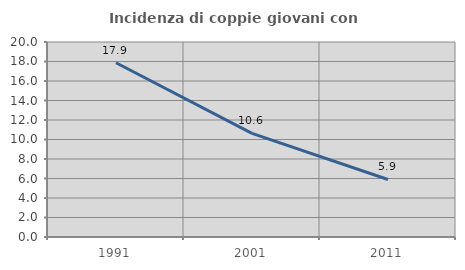
| Category | Incidenza di coppie giovani con figli |
|---|---|
| 1991.0 | 17.874 |
| 2001.0 | 10.628 |
| 2011.0 | 5.901 |